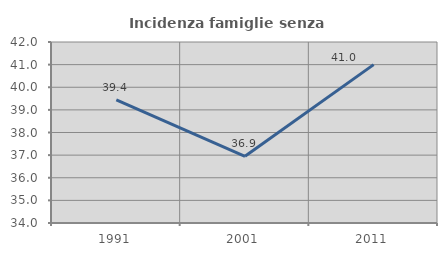
| Category | Incidenza famiglie senza nuclei |
|---|---|
| 1991.0 | 39.437 |
| 2001.0 | 36.948 |
| 2011.0 | 41 |